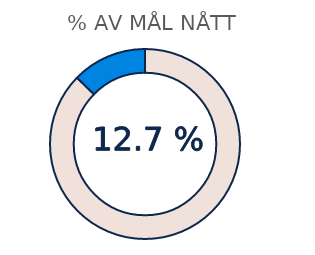
| Category | Series 1 |
|---|---|
| 0 | 0.873 |
| 1 | 0.127 |